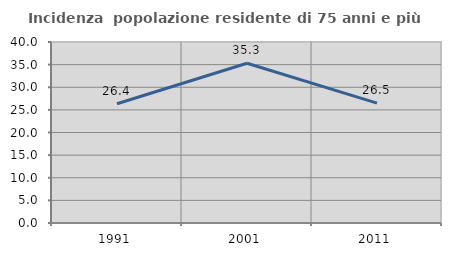
| Category | Incidenza  popolazione residente di 75 anni e più |
|---|---|
| 1991.0 | 26.351 |
| 2001.0 | 35.294 |
| 2011.0 | 26.506 |